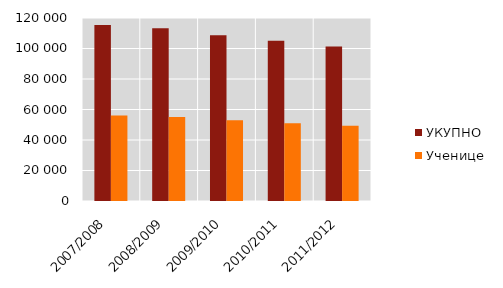
| Category | УКУПНО | Ученице |
|---|---|---|
| 2007/2008 | 115430 | 56116 |
| 2008/2009 | 113320 | 55081 |
| 2009/2010 | 108736 | 52909 |
| 2010/2011 | 105028 | 51003 |
| 2011/2012 | 101376 | 49266 |